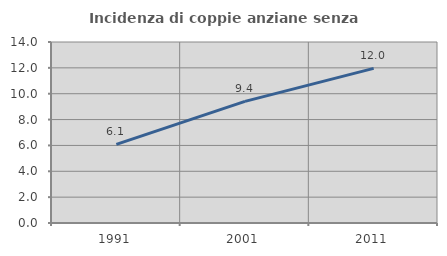
| Category | Incidenza di coppie anziane senza figli  |
|---|---|
| 1991.0 | 6.083 |
| 2001.0 | 9.404 |
| 2011.0 | 11.958 |